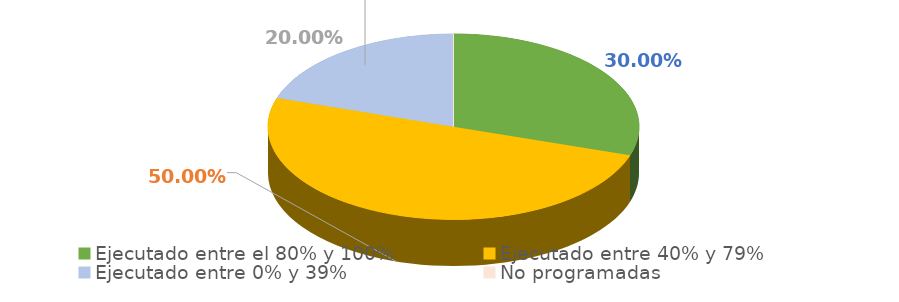
| Category | Series 0 |
|---|---|
| Ejecutado entre el 80% y 100% | 0.3 |
| Ejecutado entre 40% y 79% | 0.5 |
| Ejecutado entre 0% y 39% | 0.2 |
| No programadas | 0 |